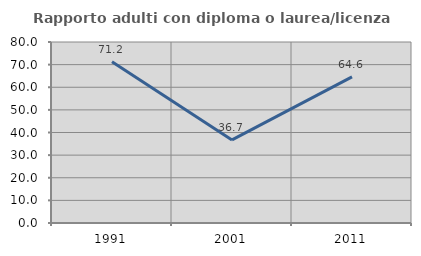
| Category | Rapporto adulti con diploma o laurea/licenza media  |
|---|---|
| 1991.0 | 71.223 |
| 2001.0 | 36.735 |
| 2011.0 | 64.602 |